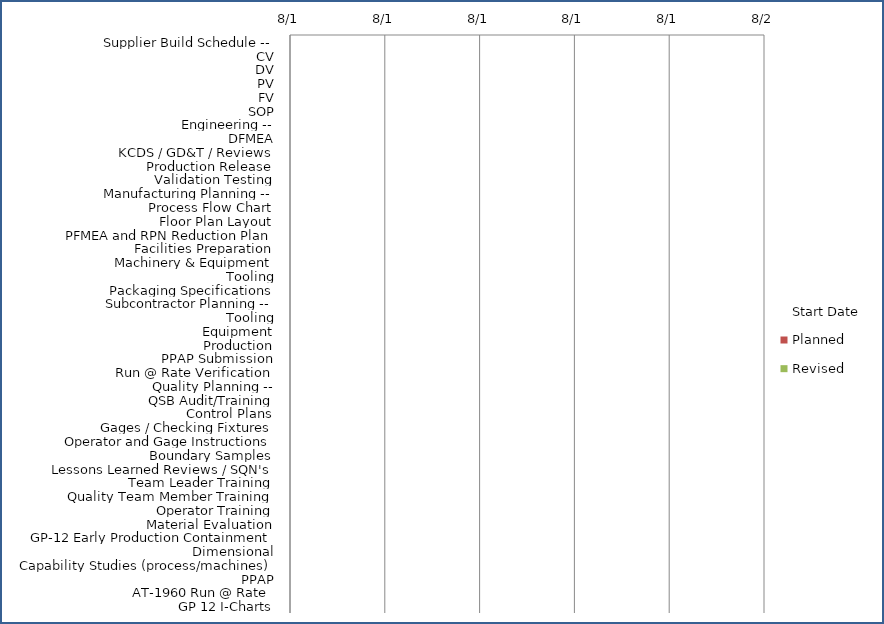
| Category | Start Date | Planned | Revised | Actual |
|---|---|---|---|---|
| Supplier Build Schedule -- |  | 0 | 0 | 0 |
|   CV |  | 0 | 0 | 0 |
|   DV |  | 0 | 0 | 0 |
|   PV |  | 0 | 0 | 0 |
|   FV |  | 0 | 0 | 0 |
|   SOP |  | 0 | 0 | 0 |
| Engineering -- |  | 0 | 0 | 0 |
|   DFMEA |  | 0 | 0 | 0 |
|   KCDS / GD&T / Reviews |  | 0 | 0 | 0 |
|   Production Release |  | 0 | 0 | 0 |
|   Validation Testing |  | 0 | 0 | 0 |
| Manufacturing Planning -- |  | 0 | 0 | 0 |
|   Process Flow Chart |  | 0 | 0 | 0 |
|   Floor Plan Layout |  | 0 | 0 | 0 |
|   PFMEA and RPN Reduction Plan |  | 0 | 0 | 0 |
|   Facilities Preparation |  | 0 | 0 | 0 |
|   Machinery & Equipment |  | 0 | 0 | 0 |
|   Tooling |  | 0 | 0 | 0 |
|   Packaging Specifications |  | 0 | 0 | 0 |
| Subcontractor Planning -- |  | 0 | 0 | 0 |
|   Tooling |  | 0 | 0 | 0 |
|   Equipment |  | 0 | 0 | 0 |
|   Production |  | 0 | 0 | 0 |
|   PPAP Submission |  | 0 | 0 | 0 |
|   Run @ Rate Verification |  | 0 | 0 | 0 |
| Quality Planning -- |  | 0 | 0 | 0 |
|   QSB Audit/Training |  | 0 | 0 | 0 |
|   Control Plans |  | 0 | 0 | 0 |
|   Gages / Checking Fixtures |  | 0 | 0 | 0 |
|   Operator and Gage Instructions |  | 0 | 0 | 0 |
|   Boundary Samples |  | 0 | 0 | 0 |
|   Lessons Learned Reviews / SQN's |  | 0 | 0 | 0 |
|   Team Leader Training |  | 0 | 0 | 0 |
|   Quality Team Member Training |  | 0 | 0 | 0 |
|   Operator Training |  | 0 | 0 | 0 |
|   Material Evaluation |  | 0 | 0 | 0 |
|   GP-12 Early Production Containment |  | 0 | 0 | 0 |
|   Dimensional |  | 0 | 0 | 0 |
|   Capability Studies (process/machines) |  | 0 | 0 | 0 |
|   PPAP |  | 0 | 0 | 0 |
| AT-1960 Run @ Rate  |  | 0 | 0 | 0 |
|   GP 12 I-Charts |  | 0 | 0 | 0 |